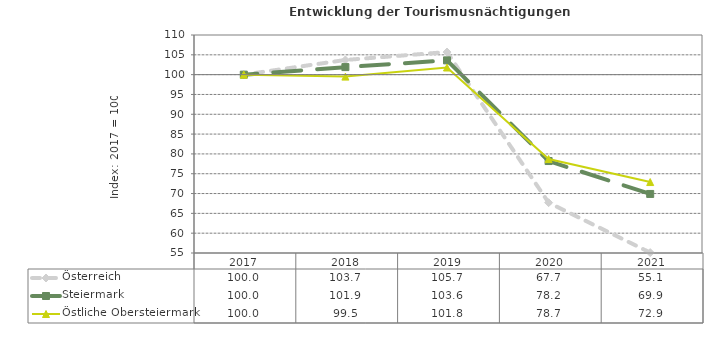
| Category | Österreich | Steiermark | Östliche Obersteiermark |
|---|---|---|---|
| 2021.0 | 55.1 | 69.9 | 72.9 |
| 2020.0 | 67.7 | 78.2 | 78.7 |
| 2019.0 | 105.7 | 103.6 | 101.8 |
| 2018.0 | 103.7 | 101.9 | 99.5 |
| 2017.0 | 100 | 100 | 100 |